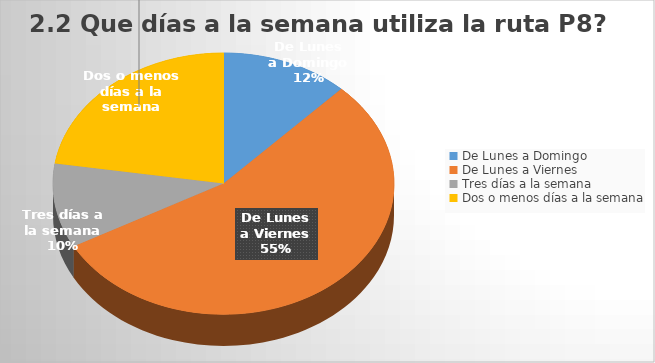
| Category | Series 0 |
|---|---|
| De Lunes a Domingo | 43 |
| De Lunes a Viernes | 195 |
| Tres días a la semana | 37 |
| Dos o menos días a la semana | 80 |